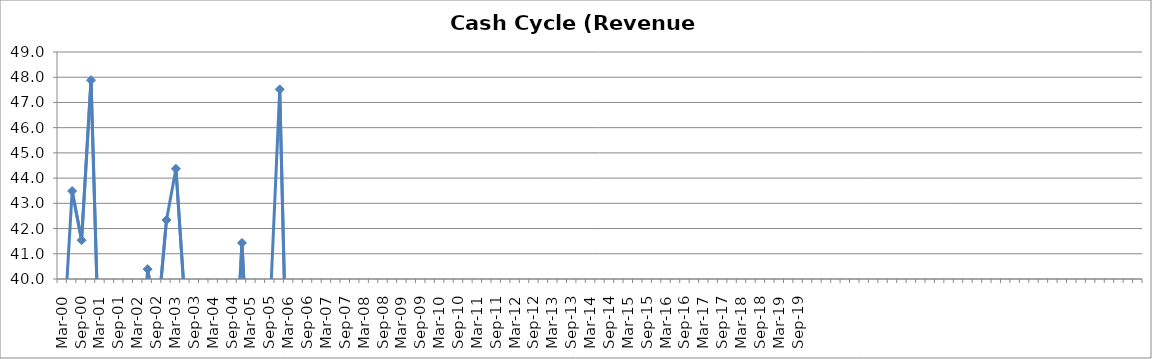
| Category | Series 0 |
|---|---|
| Mar-00 | 37.1 |
| Jun-00 | 43.49 |
| Sep-00 | 41.538 |
| Dec-00 | 47.882 |
| Mar-01 | 34.971 |
| Jun-01 | 31.026 |
| Sep-01 | 30.335 |
| Dec-01 | 31.182 |
| Mar-02 | 35.425 |
| Jun-02 | 40.391 |
| Sep-02 | 38.217 |
| Dec-02 | 42.34 |
| Mar-03 | 44.37 |
| Jun-03 | 38.772 |
| Sep-03 | 33.252 |
| Dec-03 | 37.375 |
| Mar-04 | 33.7 |
| Jun-04 | 37.587 |
| Sep-04 | 34.509 |
| Dec-04 | 41.429 |
| Mar-05 | 33.997 |
| Jun-05 | 36.553 |
| Sep-05 | 39.059 |
| Dec-05 | 47.519 |
| Mar-06 | 31.978 |
| Jun-06 | 27.432 |
| Sep-06 | 25.099 |
| Dec-06 | 35.47 |
| Mar-07 | 33.014 |
| Jun-07 | 30.374 |
| Sep-07 | 31.118 |
| Dec-07 | 34.726 |
| Mar-08 | 33.81 |
| Jun-08 | 35.615 |
| Sep-08 | 25.683 |
| Dec-08 | 22.666 |
| Mar-09 | 17.791 |
| Jun-09 | 22.836 |
| Sep-09 | 31.443 |
| Dec-09 | 37.938 |
| Mar-10 | 32.302 |
| Jun-10 | 30.363 |
| Sep-10 | 27.216 |
| Dec-10 | 34.375 |
| Mar-11 | 31.026 |
| Jun-11 | 30.445 |
| Sep-11 | 26.672 |
| Dec-11 | 28.586 |
| Mar-12 | 25.907 |
| Jun-12 | 23.777 |
| Sep-12 | 26.324 |
| Dec-12 | 33.199 |
| Mar-13 | 33.457 |
| Jun-13 | 33.873 |
| Sep-13 | 30.637 |
| Dec-13 | 34.057 |
| Mar-14 | 31.481 |
| Jun-14 | 31.392 |
| Sep-14 | 29.263 |
| Dec-14 | 28.317 |
| Mar-15 | 23.194 |
| Jun-15 | 24.765 |
| Sep-15 | 27.123 |
| Dec-15 | 29.335 |
| Mar-16 | 28.09 |
| Jun-16 | 27.398 |
| Sep-16 | 27.661 |
| Dec-16 | 30.899 |
| Mar-17 | 26.906 |
| Jun-17 | 24.044 |
| Sep-17 | 28.122 |
| Dec-17 | 33.327 |
| Mar-18 | 31.045 |
| Jun-18 | 29.042 |
| Sep-18 | 30.802 |
| Dec-18 | 28.534 |
| Mar-19 | 29.921 |
| Jun-19 | 27.61 |
| Sep-19 | 27.481 |